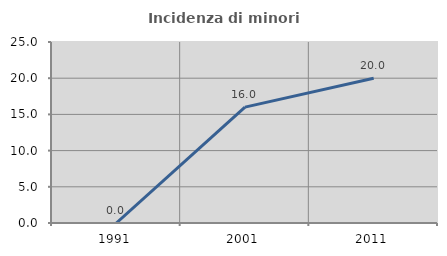
| Category | Incidenza di minori stranieri |
|---|---|
| 1991.0 | 0 |
| 2001.0 | 16 |
| 2011.0 | 20 |